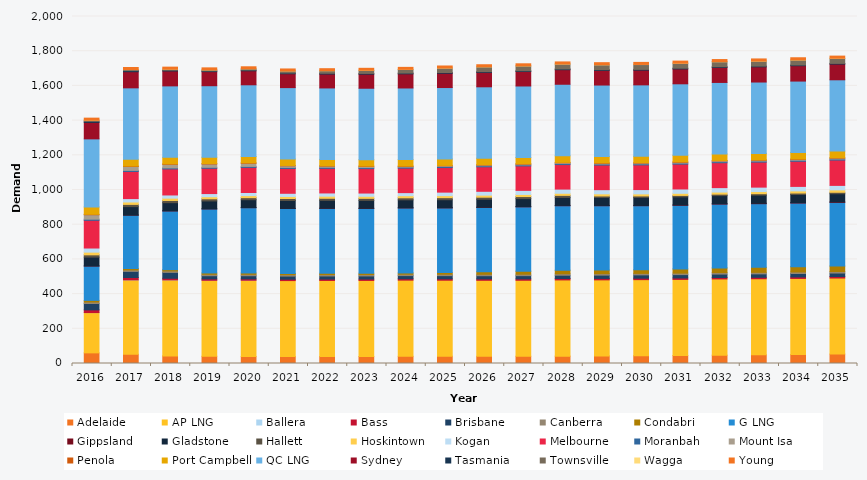
| Category | Adelaide | AP LNG | Ballera | Bass | Brisbane | Canberra | Condabri | G LNG | Gippsland | Gladstone | Hallett | Hoskintown | Kogan | Melbourne | Moranbah | Mount Isa | Penola | Port Campbell | QC LNG | Sydney | Tasmania | Townsville | Wagga | Young |
|---|---|---|---|---|---|---|---|---|---|---|---|---|---|---|---|---|---|---|---|---|---|---|---|---|
| 2016.0 | 61.286 | 232.174 | 0.019 | 15.569 | 36.923 | 8.563 | 9.23 | 198.09 | 0.555 | 50.712 | 13.191 | 15.516 | 23.745 | 159.734 | 6.453 | 25.541 | 2.566 | 42.287 | 392.601 | 94.666 | 6.3 | 6.367 | 0.127 | 11.985 |
| 2017.0 | 53.095 | 428.848 | 0.02 | 13.677 | 35.282 | 8.569 | 7.919 | 307.702 | 0.452 | 48.604 | 12.914 | 13.841 | 19.581 | 156.304 | 6.171 | 22.447 | 2.444 | 38.988 | 411.939 | 92.903 | 6.348 | 6.106 | 0.027 | 11.896 |
| 2018.0 | 43.894 | 437.977 | 0.028 | 9.329 | 33.893 | 8.477 | 7.345 | 338.406 | 0.919 | 46.723 | 12.669 | 13.374 | 18.373 | 149.816 | 5.918 | 20.947 | 2.382 | 37.727 | 411.939 | 85.849 | 4.447 | 5.91 | 0.067 | 11.724 |
| 2019.0 | 41.424 | 437.977 | 0.024 | 8.031 | 18.522 | 8.358 | 7.336 | 369.364 | 0.591 | 45.384 | 12.246 | 12.033 | 18.137 | 145.622 | 5.643 | 19.169 | 2.314 | 36.985 | 411.939 | 81 | 4.47 | 5.755 | 0.074 | 11.539 |
| 2020.0 | 40.523 | 439.149 | 0.021 | 7.949 | 18.296 | 8.246 | 7.394 | 376.402 | 0.806 | 45.245 | 11.812 | 11.86 | 17.954 | 144.533 | 5.759 | 18.057 | 2.304 | 37.001 | 413.042 | 80.634 | 4.484 | 7.114 | 0.135 | 11.458 |
| 2021.0 | 39.871 | 437.996 | 0 | 7.865 | 18.111 | 8.11 | 7.4 | 373.852 | 0.912 | 45.214 | 11.689 | 11.754 | 18.287 | 143.134 | 5.882 | 9.036 | 2.277 | 36.795 | 411.912 | 79.84 | 4.491 | 11.785 | 0.098 | 11.329 |
| 2022.0 | 40.573 | 438.025 | 0 | 7.831 | 18.13 | 8.044 | 7.632 | 373.852 | 1.009 | 45.36 | 11.756 | 12.213 | 18.589 | 141.688 | 6.022 | 6.631 | 2.325 | 36.664 | 411.868 | 79.986 | 4.493 | 14.869 | 0.316 | 11.282 |
| 2023.0 | 40.709 | 438.055 | 0 | 7.801 | 18.16 | 8.052 | 7.513 | 373.501 | 1.002 | 45.416 | 11.692 | 11.89 | 18.676 | 140.726 | 6.015 | 6.661 | 2.316 | 36.496 | 411.824 | 80.99 | 4.49 | 17.483 | 0.613 | 11.299 |
| 2024.0 | 41.234 | 439.257 | 0 | 7.859 | 18.342 | 8.117 | 7.279 | 374.502 | 1.109 | 45.59 | 11.669 | 12.161 | 17.751 | 141.025 | 6.024 | 3.96 | 2.3 | 36.923 | 412.882 | 81.45 | 4.482 | 20.927 | 0.595 | 11.376 |
| 2025.0 | 41.912 | 438.114 | 0 | 7.923 | 18.526 | 8.176 | 9.382 | 372.794 | 1.314 | 45.776 | 11.829 | 11.718 | 20.301 | 141.525 | 6.034 | 4.076 | 2.362 | 36.995 | 411.736 | 82.306 | 4.468 | 25.352 | 0.682 | 11.447 |
| 2026.0 | 41.337 | 438.144 | 0 | 7.954 | 18.642 | 8.234 | 14.413 | 370.693 | 1.452 | 45.869 | 11.732 | 11.869 | 22.231 | 141.111 | 6.033 | 4.119 | 2.328 | 36.931 | 411.692 | 82.915 | 4.451 | 27.524 | 0.795 | 11.515 |
| 2027.0 | 41.494 | 438.173 | 0 | 7.998 | 18.813 | 8.295 | 17.401 | 370.693 | 1.59 | 46.018 | 11.709 | 12.204 | 23.463 | 140.902 | 6.04 | 4.233 | 2.295 | 36.576 | 411.648 | 83.299 | 4.43 | 27.784 | 0.746 | 11.586 |
| 2028.0 | 42.381 | 439.375 | 0 | 8.053 | 18.983 | 8.362 | 20.441 | 371.686 | 1.874 | 46.184 | 11.747 | 11.965 | 24.184 | 141.222 | 6.047 | 4.339 | 2.339 | 37.606 | 412.706 | 83.8 | 4.405 | 28.112 | 0.714 | 11.662 |
| 2029.0 | 43.899 | 438.232 | 0 | 8.12 | 19.144 | 8.437 | 20.736 | 370.693 | 1.809 | 46.312 | 8.224 | 12.282 | 24.008 | 141.708 | 6.051 | 4.43 | 2.324 | 36.926 | 411.56 | 84.401 | 4.376 | 27.715 | 0.721 | 11.744 |
| 2030.0 | 45.077 | 438.262 | 0 | 8.193 | 19.306 | 8.513 | 20.351 | 369.723 | 1.662 | 46.456 | 8.227 | 11.831 | 24.847 | 142.171 | 6.055 | 4.519 | 2.302 | 36.932 | 411.517 | 84.82 | 4.344 | 27.973 | 0.552 | 11.827 |
| 2031.0 | 46.345 | 438.291 | 0 | 8.267 | 19.476 | 8.59 | 24.063 | 366.846 | 2.053 | 46.613 | 8.296 | 12.036 | 25.042 | 143.116 | 6.062 | 4.611 | 2.32 | 38.586 | 411.473 | 85.699 | 4.311 | 28.218 | 0.709 | 11.911 |
| 2032.0 | 47.96 | 439.494 | 0 | 8.33 | 19.643 | 8.665 | 26.921 | 367.828 | 2.188 | 46.752 | 8.303 | 11.918 | 25.744 | 143.525 | 6.068 | 4.702 | 2.323 | 37.059 | 412.53 | 86.506 | 4.276 | 28.299 | 0.845 | 11.993 |
| 2033.0 | 50.105 | 438.351 | 0 | 8.395 | 19.803 | 8.741 | 28.877 | 366.846 | 2.374 | 46.891 | 8.308 | 12.296 | 25.571 | 144.083 | 6.073 | 4.791 | 2.271 | 37.158 | 411.385 | 87.576 | 4.241 | 28.399 | 0.812 | 12.075 |
| 2034.0 | 51.92 | 438.38 | 0 | 8.461 | 19.964 | 8.814 | 30.434 | 366.846 | 2.346 | 47.036 | 8.259 | 12.348 | 25.922 | 144.76 | 6.091 | 4.879 | 2.255 | 37.748 | 411.341 | 88.568 | 4.206 | 28.584 | 0.87 | 12.155 |
| 2035.0 | 54.322 | 438.41 | 0 | 8.525 | 20.121 | 8.889 | 31.408 | 366.846 | 2.862 | 47.177 | 8.273 | 13.704 | 26.001 | 145.938 | 6.108 | 4.966 | 2.369 | 38.378 | 410.891 | 90.408 | 4.169 | 28.756 | 0.973 | 12.237 |